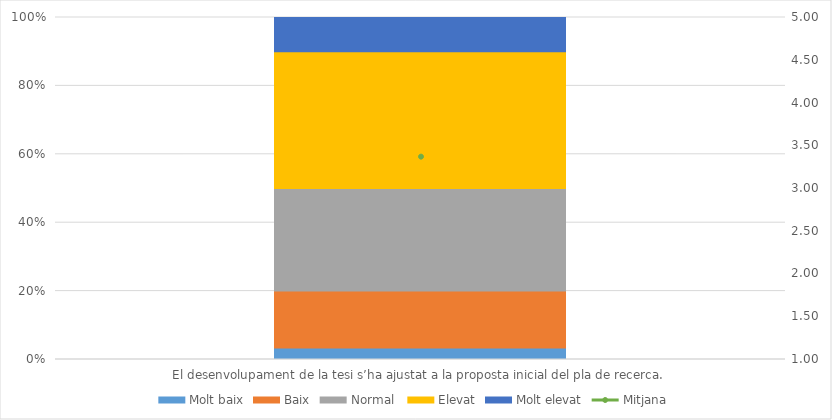
| Category | Molt baix | Baix | Normal  | Elevat | Molt elevat |
|---|---|---|---|---|---|
| El desenvolupament de la tesi s’ha ajustat a la proposta inicial del pla de recerca. | 1 | 5 | 9 | 12 | 3 |